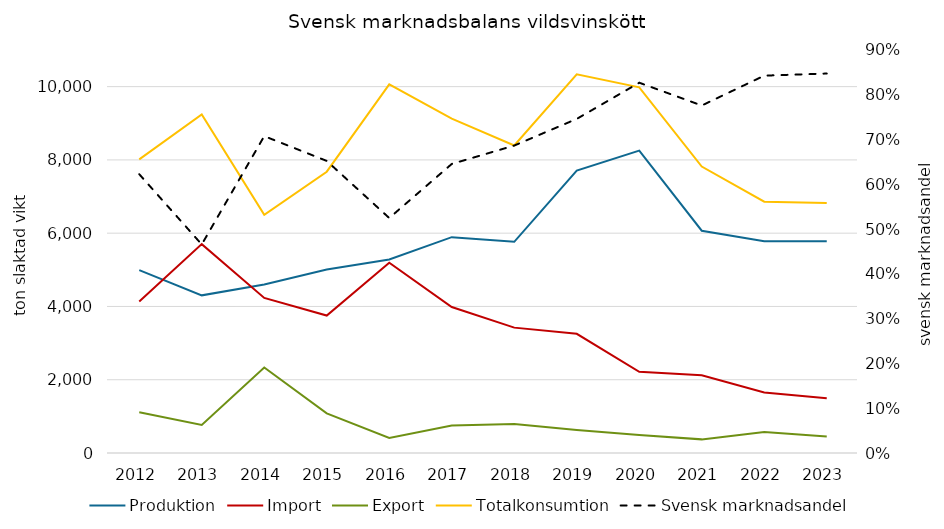
| Category | Produktion | Import | Export | Totalkonsumtion |
|---|---|---|---|---|
| 2012.0 | 4991 | 4137 | 1112 | 8016 |
| 2013.0 | 4303 | 5701 | 765 | 9239 |
| 2014.0 | 4599 | 4233 | 2333 | 6499 |
| 2015.0 | 5008 | 3751 | 1081 | 7678 |
| 2016.0 | 5280 | 5193 | 412 | 10061 |
| 2017.0 | 5891 | 3985 | 750 | 9126 |
| 2018.0 | 5764 | 3422 | 791 | 8395 |
| 2019.0 | 7711 | 3254 | 630 | 10335 |
| 2020.0 | 8254 | 2217 | 490 | 9981 |
| 2021.0 | 6067 | 2123 | 372 | 7818 |
| 2022.0 | 5782 | 1652 | 573 | 6861 |
| 2023.0 | 5782 | 1493 | 452 | 6823 |